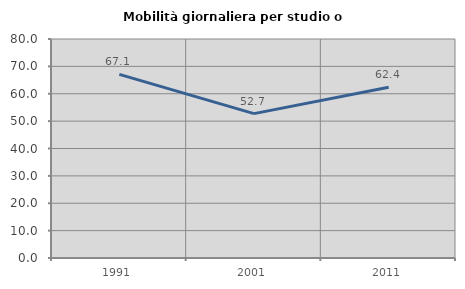
| Category | Mobilità giornaliera per studio o lavoro |
|---|---|
| 1991.0 | 67.067 |
| 2001.0 | 52.736 |
| 2011.0 | 62.366 |